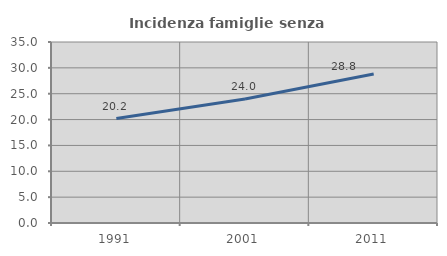
| Category | Incidenza famiglie senza nuclei |
|---|---|
| 1991.0 | 20.194 |
| 2001.0 | 23.99 |
| 2011.0 | 28.819 |